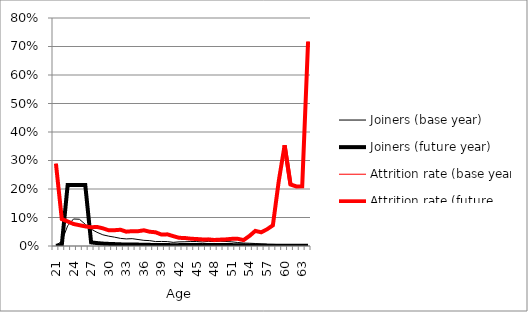
| Category | Joiners (base year) | Joiners (future year) | Attrition rate (base year) | Attrition rate (future year) |
|---|---|---|---|---|
| 21.0 | 0.002 | 0.001 | 0.289 | 0.289 |
| 22.0 | 0.017 | 0.004 | 0.094 | 0.094 |
| 23.0 | 0.071 | 0.214 | 0.086 | 0.086 |
| 24.0 | 0.095 | 0.214 | 0.077 | 0.077 |
| 25.0 | 0.094 | 0.214 | 0.073 | 0.073 |
| 26.0 | 0.076 | 0.214 | 0.069 | 0.069 |
| 27.0 | 0.059 | 0.013 | 0.066 | 0.066 |
| 28.0 | 0.048 | 0.01 | 0.067 | 0.067 |
| 29.0 | 0.039 | 0.008 | 0.062 | 0.062 |
| 30.0 | 0.035 | 0.007 | 0.055 | 0.055 |
| 31.0 | 0.031 | 0.007 | 0.055 | 0.055 |
| 32.0 | 0.027 | 0.006 | 0.057 | 0.057 |
| 33.0 | 0.025 | 0.005 | 0.05 | 0.05 |
| 34.0 | 0.026 | 0.006 | 0.052 | 0.052 |
| 35.0 | 0.023 | 0.005 | 0.052 | 0.052 |
| 36.0 | 0.02 | 0.004 | 0.055 | 0.055 |
| 37.0 | 0.019 | 0.004 | 0.05 | 0.05 |
| 38.0 | 0.016 | 0.003 | 0.048 | 0.048 |
| 39.0 | 0.016 | 0.003 | 0.04 | 0.04 |
| 40.0 | 0.015 | 0.003 | 0.041 | 0.041 |
| 41.0 | 0.013 | 0.003 | 0.035 | 0.035 |
| 42.0 | 0.015 | 0.003 | 0.029 | 0.029 |
| 43.0 | 0.015 | 0.003 | 0.028 | 0.028 |
| 44.0 | 0.016 | 0.003 | 0.026 | 0.026 |
| 45.0 | 0.016 | 0.003 | 0.024 | 0.024 |
| 46.0 | 0.014 | 0.003 | 0.023 | 0.023 |
| 47.0 | 0.016 | 0.003 | 0.023 | 0.023 |
| 48.0 | 0.016 | 0.003 | 0.021 | 0.021 |
| 49.0 | 0.017 | 0.004 | 0.022 | 0.022 |
| 50.0 | 0.016 | 0.003 | 0.023 | 0.023 |
| 51.0 | 0.015 | 0.003 | 0.025 | 0.025 |
| 52.0 | 0.012 | 0.003 | 0.025 | 0.025 |
| 53.0 | 0.01 | 0.002 | 0.021 | 0.021 |
| 54.0 | 0.01 | 0.002 | 0.035 | 0.035 |
| 55.0 | 0.009 | 0.002 | 0.053 | 0.053 |
| 56.0 | 0.007 | 0.002 | 0.048 | 0.048 |
| 57.0 | 0.006 | 0.001 | 0.059 | 0.059 |
| 58.0 | 0.006 | 0.001 | 0.073 | 0.073 |
| 59.0 | 0.005 | 0.001 | 0.228 | 0.228 |
| 60.0 | 0.004 | 0.001 | 0.353 | 0.353 |
| 61.0 | 0.003 | 0.001 | 0.216 | 0.216 |
| 62.0 | 0.003 | 0.001 | 0.209 | 0.209 |
| 63.0 | 0.003 | 0.001 | 0.21 | 0.21 |
| 64.0 | 0.002 | 0 | 0.718 | 0.718 |